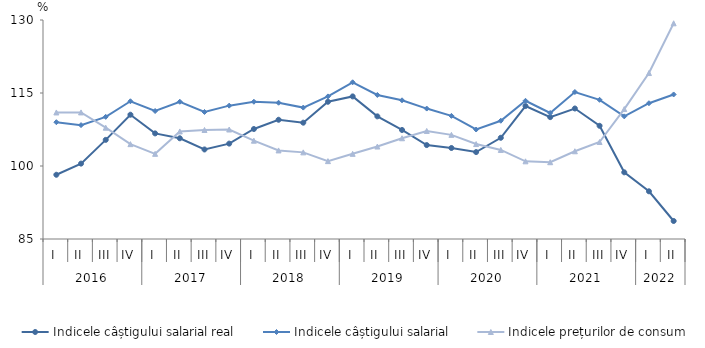
| Category | Indicele câștigului salarial real | Indicele câștigului salarial | Indicele prețurilor de consum |
|---|---|---|---|
| 0 | 98.2 | 109 | 111 |
| 1 | 100.491 | 108.4 | 111.01 |
| 2 | 105.369 | 110.1 | 107.87 |
| 3 | 110.537 | 113.3 | 104.49 |
| 4 | 106.7 | 111.3 | 102.5 |
| 5 | 105.7 | 113.2 | 107.1 |
| 6 | 103.4 | 111.1 | 107.4 |
| 7 | 104.6 | 112.4 | 107.5 |
| 8 | 107.6 | 113.2 | 105.2 |
| 9 | 109.5 | 113 | 103.2 |
| 10 | 108.9 | 112 | 102.8 |
| 11 | 113.2 | 114.3 | 101 |
| 12 | 114.3 | 117.2 | 102.5 |
| 13 | 110.2 | 114.6 | 104 |
| 14 | 107.4 | 113.5 | 105.7 |
| 15 | 104.3 | 111.8 | 107.2 |
| 16 | 103.7 | 110.3 | 106.4 |
| 17 | 102.861 | 107.5 | 104.51 |
| 18 | 105.8 | 109.3 | 103.3 |
| 19 | 112.322 | 113.4 | 100.96 |
| 20 | 110.042 | 110.9 | 100.78 |
| 21 | 111.816 | 115.2 | 103.026 |
| 22 | 108.263 | 113.6 | 104.93 |
| 23 | 98.7 | 110.2 | 111.7 |
| 24 | 94.8 | 112.9 | 119.1 |
| 25 | 88.7 | 114.7 | 129.32 |